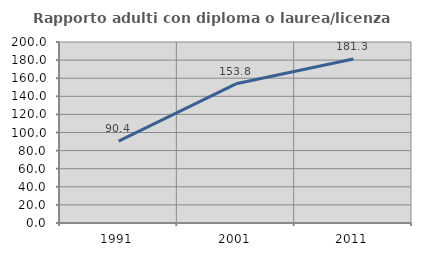
| Category | Rapporto adulti con diploma o laurea/licenza media  |
|---|---|
| 1991.0 | 90.404 |
| 2001.0 | 153.807 |
| 2011.0 | 181.281 |